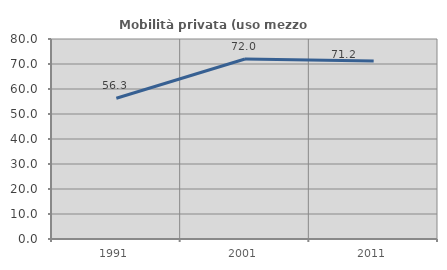
| Category | Mobilità privata (uso mezzo privato) |
|---|---|
| 1991.0 | 56.304 |
| 2001.0 | 72.023 |
| 2011.0 | 71.192 |